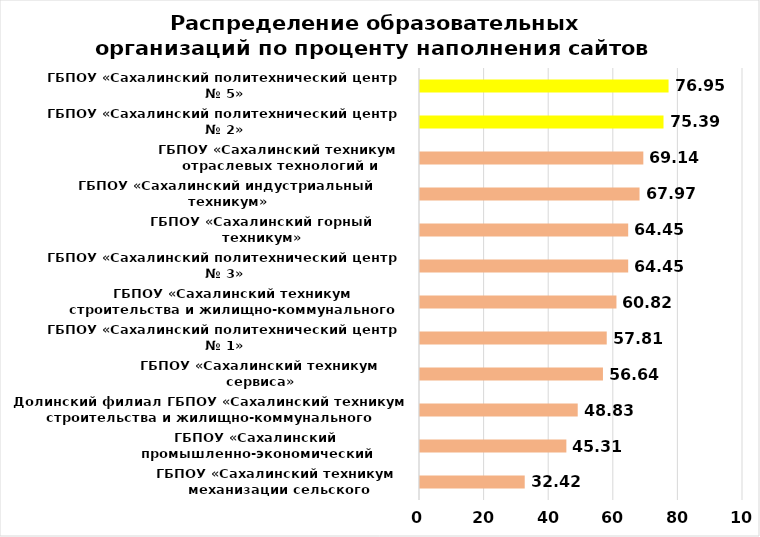
| Category | Series 0 |
|---|---|
| ГБПОУ «Сахалинский техникум
 механизации сельского хозяйства» | 32.422 |
| ГБПОУ «Сахалинский 
промышленно-экономический техникум» | 45.312 |
| Долинский филиал ГБПОУ «Сахалинский техникум строительства и жилищно-коммунального хозяйства»  | 48.828 |
| ГБПОУ «Сахалинский техникум сервиса» | 56.641 |
| ГБПОУ «Сахалинский политехнический центр № 1» | 57.812 |
| ГБПОУ «Сахалинский техникум строительства и жилищно-коммунального хозяйства» | 60.821 |
| ГБПОУ «Сахалинский политехнический центр № 3» | 64.453 |
| ГБПОУ «Сахалинский горный техникум» | 64.453 |
| ГБПОУ «Сахалинский индустриальный техникум» | 67.969 |
| ГБПОУ «Сахалинский техникум 
отраслевых технологий и сервиса» | 69.141 |
| ГБПОУ «Сахалинский политехнический центр № 2» | 75.391 |
| ГБПОУ «Сахалинский политехнический центр № 5» | 76.953 |